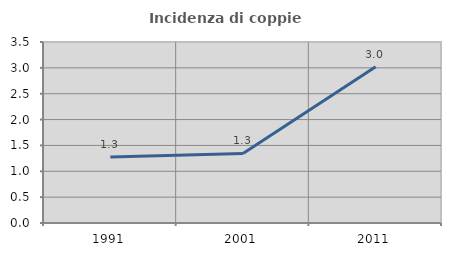
| Category | Incidenza di coppie miste |
|---|---|
| 1991.0 | 1.275 |
| 2001.0 | 1.345 |
| 2011.0 | 3.02 |